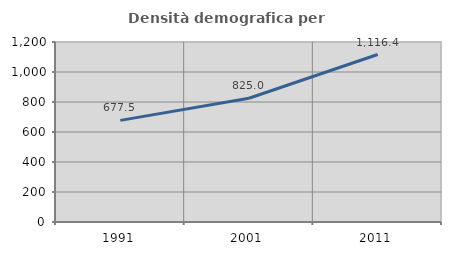
| Category | Densità demografica |
|---|---|
| 1991.0 | 677.515 |
| 2001.0 | 825.002 |
| 2011.0 | 1116.429 |